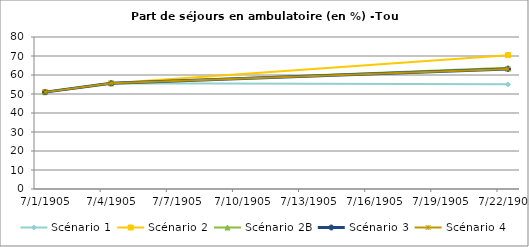
| Category | Scénario 1 | Scénario 2 | Scénario 2B | Scénario 3 | Scénario 4 |
|---|---|---|---|---|---|
| 2009.0 | 50.984 | 50.984 | 50.984 | 50.984 | 50.984 |
| 2012.0 | 55.636 | 55.636 | 55.636 | 55.636 | 55.636 |
| 2030.0 | 55.08 | 70.453 | 63.754 | 63.153 | 63.153 |